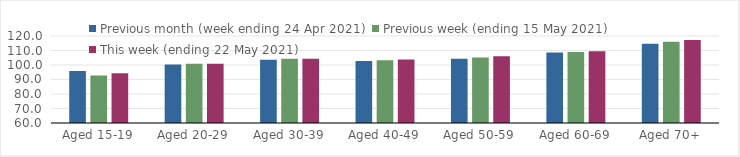
| Category | Previous month (week ending 24 Apr 2021) | Previous week (ending 15 May 2021) | This week (ending 22 May 2021) |
|---|---|---|---|
| Aged 15-19 | 95.92 | 92.78 | 94.3 |
| Aged 20-29 | 100.28 | 100.93 | 100.84 |
| Aged 30-39 | 103.55 | 104.27 | 104.36 |
| Aged 40-49 | 102.83 | 103.28 | 103.83 |
| Aged 50-59 | 104.23 | 105.21 | 105.99 |
| Aged 60-69 | 108.68 | 108.93 | 109.49 |
| Aged 70+ | 114.64 | 116.04 | 117.2 |